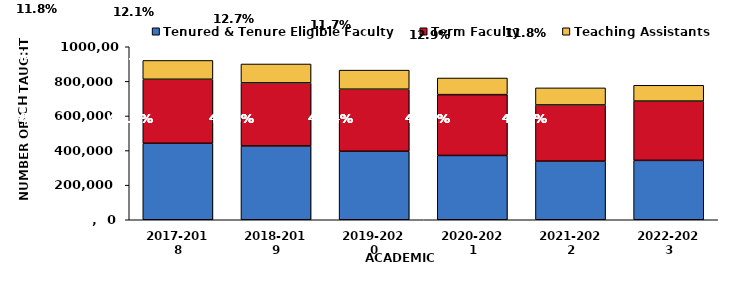
| Category | Tenured & Tenure Eligible Faculty | Term Faculty | Teaching Assistants |
|---|---|---|---|
| 2017-2018 | 442063.2 | 369996.7 | 108875.4 |
| 2018-2019 | 426701.9 | 364480.1 | 109197.7 |
| 2019-2020 | 395880.1 | 358821.8 | 110238.1 |
| 2020-2021 | 371729.3 | 351533.7 | 96149.7 |
| 2021-2022 | 338837.078 | 324757.837 | 98652.965 |
| 2022-2023 | 343145.418 | 342812.376 | 91356.452 |